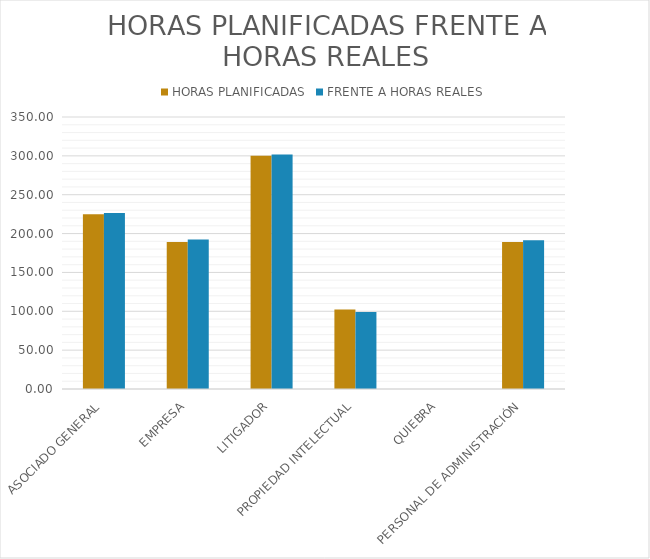
| Category | HORAS PLANIFICADAS | FRENTE A HORAS REALES |
|---|---|---|
| ASOCIADO GENERAL | 225 | 226.5 |
| EMPRESA | 189.286 | 192.5 |
| LITIGADOR | 300 | 301.714 |
| PROPIEDAD INTELECTUAL | 102.143 | 99 |
| QUIEBRA | 0 | 0 |
| PERSONAL DE ADMINISTRACIÓN | 189.286 | 191.429 |